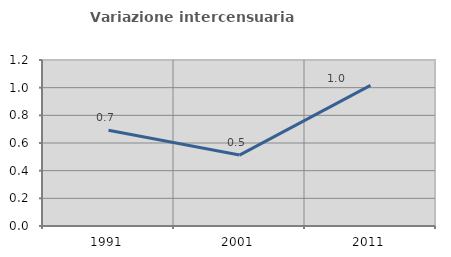
| Category | Variazione intercensuaria annua |
|---|---|
| 1991.0 | 0.692 |
| 2001.0 | 0.513 |
| 2011.0 | 1.016 |